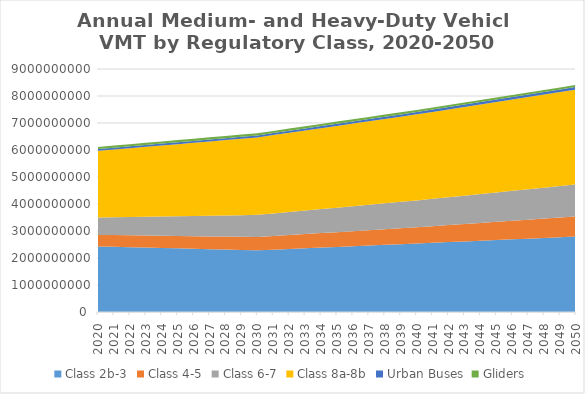
| Category | Class 2b-3 | Class 4-5 | Class 6-7 | Class 8a-8b | Urban Buses | Gliders |
|---|---|---|---|---|---|---|
| 2020.0 | 2429700823.077 | 425541112.231 | 645790258.538 | 2467603134.462 | 67832502.363 | 74858505.623 |
| 2021.0 | 2415184430.769 | 432185628.308 | 663303804.385 | 2507735674.615 | 68239777.88 | 75584625.632 |
| 2022.0 | 2400668038.462 | 438830144.385 | 680817350.231 | 2547868214.769 | 68647053.397 | 76310745.642 |
| 2023.0 | 2386151646.154 | 445474660.462 | 698330896.077 | 2588000754.923 | 69054328.913 | 77036865.651 |
| 2024.0 | 2371635253.846 | 452119176.538 | 715844441.923 | 2628133295.077 | 69461604.43 | 77762985.661 |
| 2025.0 | 2357118861.538 | 458763692.615 | 733357987.769 | 2668265835.231 | 69868879.947 | 78489105.671 |
| 2026.0 | 2342602469.231 | 465408208.692 | 750871533.615 | 2708398375.385 | 70276155.464 | 79215225.68 |
| 2027.0 | 2328086076.923 | 472052724.769 | 768385079.462 | 2748530915.538 | 70683430.981 | 79941345.69 |
| 2028.0 | 2313569684.615 | 478697240.846 | 785898625.308 | 2788663455.692 | 71090706.498 | 80667465.7 |
| 2029.0 | 2299053292.308 | 485341756.923 | 803412171.154 | 2828795995.846 | 71497982.014 | 81393585.709 |
| 2030.0 | 2284536900 | 491986273 | 820925717 | 2868928536 | 71905257.531 | 82119705.719 |
| 2031.0 | 2309929061.8 | 502949820.3 | 838130459.6 | 2900683471.6 | 73345121.703 | 81742815.938 |
| 2032.0 | 2335321223.6 | 513913367.6 | 855335202.2 | 2932438407.2 | 74784985.875 | 81365926.156 |
| 2033.0 | 2360713385.4 | 524876914.9 | 872539944.8 | 2964193342.8 | 76224850.047 | 80989036.375 |
| 2034.0 | 2386105547.2 | 535840462.2 | 889744687.4 | 2995948278.4 | 77664714.219 | 80612146.594 |
| 2035.0 | 2411497709 | 546804009.5 | 906949430 | 3027703214 | 79104578.391 | 80235256.812 |
| 2036.0 | 2436889870.8 | 557767556.8 | 924154172.6 | 3059458149.6 | 80544442.562 | 79858367.031 |
| 2037.0 | 2462282032.6 | 568731104.1 | 941358915.2 | 3091213085.2 | 81984306.734 | 79481477.25 |
| 2038.0 | 2487674194.4 | 579694651.4 | 958563657.8 | 3122968020.8 | 83424170.906 | 79104587.469 |
| 2039.0 | 2513066356.2 | 590658198.7 | 975768400.4 | 3154722956.4 | 84864035.078 | 78727697.688 |
| 2040.0 | 2538458518 | 601621746 | 992973143 | 3186477892 | 86303899.25 | 78350807.906 |
| 2041.0 | 2564011382.6 | 616077985 | 1011938342.5 | 3219381900.2 | 87539173.456 | 77826755.322 |
| 2042.0 | 2589564247.2 | 630534224 | 1030903542 | 3252285908.4 | 88774447.662 | 77302702.738 |
| 2043.0 | 2615117111.8 | 644990463 | 1049868741.5 | 3285189916.6 | 90009721.869 | 76778650.153 |
| 2044.0 | 2640669976.4 | 659446702 | 1068833941 | 3318093924.8 | 91244996.075 | 76254597.569 |
| 2045.0 | 2666222841 | 673902941 | 1087799140.5 | 3350997933 | 92480270.281 | 75730544.984 |
| 2046.0 | 2691775705.6 | 688359180 | 1106764340 | 3383901941.2 | 93715544.488 | 75206492.4 |
| 2047.0 | 2717328570.2 | 702815419 | 1125729539.5 | 3416805949.4 | 94950818.694 | 74682439.816 |
| 2048.0 | 2742881434.8 | 717271658 | 1144694739 | 3449709957.6 | 96186092.9 | 74158387.231 |
| 2049.0 | 2768434299.4 | 731727897 | 1163659938.5 | 3482613965.8 | 97421367.106 | 73634334.647 |
| 2050.0 | 2793987164 | 746184136 | 1182625138 | 3515517974 | 98656641.312 | 73110282.062 |